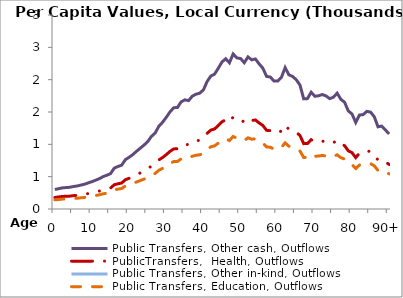
| Category | Public Transfers, Other cash, Outflows | PublicTransfers,  Health, Outflows | Public Transfers, Other in-kind, Outflows | Public Transfers, Education, Outflows |
|---|---|---|---|---|
| 0 | 301.665 | 178.993 |  | 141.159 |
|  | 313.957 | 186.286 |  | 146.911 |
| 2 | 326.249 | 193.58 |  | 152.663 |
| 3 | 331.667 | 196.794 |  | 155.198 |
| 4 | 335.278 | 198.937 |  | 156.888 |
| 5 | 347.988 | 206.479 |  | 162.835 |
| 6 | 355.638 | 211.018 |  | 166.415 |
| 7 | 370.158 | 219.633 |  | 173.209 |
| 8 | 383.42 | 227.502 |  | 179.415 |
| 9 | 403.978 | 239.701 |  | 189.035 |
| 10 | 422.535 | 250.711 |  | 197.718 |
| 11 | 446.076 | 264.679 |  | 208.734 |
| 12 | 469.048 | 278.309 |  | 219.483 |
| 13 | 501.178 | 297.374 |  | 234.518 |
| 14 | 521.99 | 309.723 |  | 244.257 |
| 15 | 547.417 | 324.81 |  | 256.155 |
| 16 | 632.478 | 375.281 |  | 295.958 |
| 17 | 657.888 | 390.358 |  | 307.848 |
| 18 | 677.875 | 402.217 |  | 317.201 |
| 19 | 763.798 | 453.2 |  | 357.407 |
| 20 | 799.901 | 474.621 |  | 374.301 |
| 21 | 841.842 | 499.507 |  | 393.926 |
| 22 | 893.145 | 529.947 |  | 417.933 |
| 23 | 940.314 | 557.935 |  | 440.005 |
| 24 | 988.578 | 586.573 |  | 462.589 |
| 25 | 1041.515 | 617.983 |  | 487.36 |
| 26 | 1122.502 | 666.036 |  | 525.256 |
| 27 | 1174.77 | 697.05 |  | 549.715 |
| 28 | 1279.703 | 759.312 |  | 598.816 |
| 29 | 1341.296 | 795.858 |  | 627.638 |
| 30 | 1417.657 | 841.167 |  | 663.37 |
| 31 | 1501.703 | 891.035 |  | 702.697 |
| 32 | 1566.144 | 929.271 |  | 732.851 |
| 33 | 1569.927 | 931.516 |  | 734.621 |
| 34 | 1656.312 | 982.772 |  | 775.044 |
| 35 | 1688.654 | 1001.963 |  | 790.178 |
| 36 | 1675.826 | 994.351 |  | 784.175 |
| 37 | 1744.605 | 1035.161 |  | 816.359 |
| 38 | 1775.053 | 1053.228 |  | 830.607 |
| 39 | 1791.134 | 1062.769 |  | 838.132 |
| 40 | 1841.465 | 1092.633 |  | 861.683 |
| 41 | 1972.613 | 1170.45 |  | 923.052 |
| 42 | 2056.385 | 1220.156 |  | 962.252 |
| 43 | 2085.915 | 1237.678 |  | 976.07 |
| 44 | 2176.322 | 1291.321 |  | 1018.374 |
| 45 | 2273.9 | 1349.218 |  | 1064.034 |
| 46 | 2323.232 | 1378.489 |  | 1087.118 |
| 47 | 2261.125 | 1341.639 |  | 1058.057 |
| 48 | 2397.69 | 1422.669 |  | 1121.96 |
| 49 | 2336.8 | 1386.54 |  | 1093.467 |
| 50 | 2326.741 | 1380.572 |  | 1088.76 |
| 51 | 2261.995 | 1342.155 |  | 1058.464 |
| 52 | 2352.028 | 1395.576 |  | 1100.593 |
| 53 | 2306.38 | 1368.491 |  | 1079.233 |
| 54 | 2320.403 | 1376.811 |  | 1085.795 |
| 55 | 2243.446 | 1331.148 |  | 1049.784 |
| 56 | 2177.198 | 1291.84 |  | 1018.784 |
| 57 | 2050.518 | 1216.675 |  | 959.506 |
| 58 | 2041.056 | 1211.061 |  | 955.079 |
| 59 | 1978.492 | 1173.938 |  | 925.803 |
| 60 | 1980.021 | 1174.845 |  | 926.518 |
| 61 | 2036.012 | 1208.068 |  | 952.719 |
| 62 | 2186.241 | 1297.206 |  | 1023.016 |
| 63 | 2075.044 | 1231.227 |  | 970.983 |
| 64 | 2050.221 | 1216.498 |  | 959.367 |
| 65 | 1998.794 | 1185.984 |  | 935.303 |
| 66 | 1915.624 | 1136.635 |  | 896.385 |
| 67 | 1703.508 | 1010.776 |  | 797.129 |
| 68 | 1706.697 | 1012.668 |  | 798.621 |
| 69 | 1805.697 | 1071.41 |  | 844.946 |
| 70 | 1743.158 | 1034.303 |  | 815.682 |
| 71 | 1750.61 | 1038.725 |  | 819.17 |
| 72 | 1769.974 | 1050.214 |  | 828.231 |
| 73 | 1749.019 | 1037.78 |  | 818.425 |
| 74 | 1706.615 | 1012.62 |  | 798.582 |
| 75 | 1728.82 | 1025.795 |  | 808.973 |
| 76 | 1791.365 | 1062.906 |  | 838.24 |
| 77 | 1696.364 | 1006.538 |  | 793.786 |
| 78 | 1650.924 | 979.576 |  | 772.523 |
| 79 | 1516.969 | 900.093 |  | 709.841 |
| 80 | 1469.336 | 871.831 |  | 687.552 |
| 81 | 1339.142 | 794.58 |  | 626.63 |
| 82 | 1452.707 | 861.964 |  | 679.771 |
| 83 | 1459.534 | 866.014 |  | 682.965 |
| 84 | 1510.849 | 896.462 |  | 706.977 |
| 85 | 1497.69 | 888.654 |  | 700.819 |
| 86 | 1426.826 | 846.607 |  | 667.66 |
| 87 | 1271.28 | 754.314 |  | 594.875 |
| 88 | 1281.991 | 760.669 |  | 599.887 |
| 89 | 1221.597 | 724.834 |  | 571.626 |
| 90+ | 1161.181 | 688.987 |  | 543.356 |